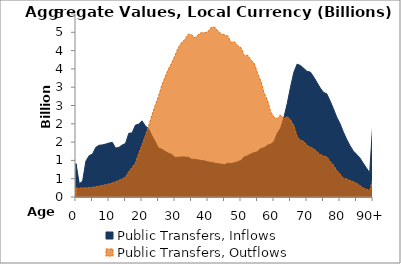
| Category | Public Transfers, Inflows | Public Transfers, Outflows |
|---|---|---|
| 0 | 908.357 | 241.403 |
|  | 362.365 | 241.246 |
| 2 | 433.946 | 246.745 |
| 3 | 978.937 | 249.458 |
| 4 | 1131.703 | 253.023 |
| 5 | 1171.33 | 266.397 |
| 6 | 1357.371 | 278.643 |
| 7 | 1413.215 | 296.881 |
| 8 | 1424.123 | 313.829 |
| 9 | 1446.317 | 336.417 |
| 10 | 1474.633 | 357.376 |
| 11 | 1493.2 | 383.52 |
| 12 | 1335.943 | 413.292 |
| 13 | 1357.548 | 455.026 |
| 14 | 1419.243 | 491.645 |
| 15 | 1463.544 | 544.06 |
| 16 | 1741.259 | 695.173 |
| 17 | 1751.261 | 805.95 |
| 18 | 1962.471 | 928.077 |
| 19 | 1990.781 | 1186.451 |
| 20 | 2081.729 | 1421.927 |
| 21 | 1944.894 | 1670.391 |
| 22 | 1866.103 | 1939.454 |
| 23 | 1677.828 | 2230.91 |
| 24 | 1516.451 | 2506.266 |
| 25 | 1334.193 | 2751.305 |
| 26 | 1308.161 | 3049.904 |
| 27 | 1247.067 | 3278.695 |
| 28 | 1197.362 | 3498.883 |
| 29 | 1161.987 | 3659.454 |
| 30 | 1080.559 | 3864.493 |
| 31 | 1085.967 | 4077.306 |
| 32 | 1095.093 | 4220.149 |
| 33 | 1091.298 | 4301.161 |
| 34 | 1085.688 | 4449.247 |
| 35 | 1033.343 | 4437.471 |
| 36 | 1030.22 | 4345.624 |
| 37 | 1012.319 | 4434.284 |
| 38 | 999.236 | 4491.493 |
| 39 | 985.195 | 4488.593 |
| 40 | 957.805 | 4516.331 |
| 41 | 946.662 | 4639.395 |
| 42 | 924.842 | 4643.056 |
| 43 | 910.898 | 4538.976 |
| 44 | 897.145 | 4457.815 |
| 45 | 882.799 | 4431.131 |
| 46 | 923.183 | 4398.732 |
| 47 | 914.987 | 4221.38 |
| 48 | 934.821 | 4243.112 |
| 49 | 965.745 | 4135.25 |
| 50 | 998.052 | 4082.99 |
| 51 | 1097.278 | 3858.017 |
| 52 | 1125.275 | 3877.286 |
| 53 | 1178.456 | 3740.149 |
| 54 | 1213.26 | 3652.975 |
| 55 | 1236.856 | 3386.703 |
| 56 | 1326.959 | 3167.71 |
| 57 | 1343.642 | 2842.753 |
| 58 | 1413.716 | 2651.069 |
| 59 | 1442.185 | 2322.765 |
| 60 | 1512.373 | 2183.08 |
| 61 | 1742.817 | 2145.016 |
| 62 | 1880.201 | 2244.713 |
| 63 | 2174.813 | 2132.589 |
| 64 | 2550.761 | 2198.179 |
| 65 | 3000.178 | 2108.741 |
| 66 | 3405.159 | 1958.098 |
| 67 | 3630.593 | 1657.149 |
| 68 | 3593.733 | 1550.805 |
| 69 | 3517.642 | 1520.143 |
| 70 | 3431.326 | 1411.174 |
| 71 | 3414.344 | 1360.114 |
| 72 | 3285.569 | 1320.26 |
| 73 | 3132.838 | 1243.785 |
| 74 | 2980.602 | 1158.035 |
| 75 | 2859.673 | 1117.271 |
| 76 | 2818.879 | 1097.542 |
| 77 | 2626.114 | 971.939 |
| 78 | 2413.715 | 871.835 |
| 79 | 2184.464 | 727.305 |
| 80 | 2007.059 | 633.09 |
| 81 | 1779.994 | 512.224 |
| 82 | 1581.652 | 494.698 |
| 83 | 1408.846 | 447.657 |
| 84 | 1262.249 | 419.812 |
| 85 | 1169.242 | 373.473 |
| 86 | 1071.897 | 316.841 |
| 87 | 930.542 | 247.29 |
| 88 | 793.979 | 213.293 |
| 89 | 661.953 | 169.903 |
| 90+ | 2121.629 | 516.726 |